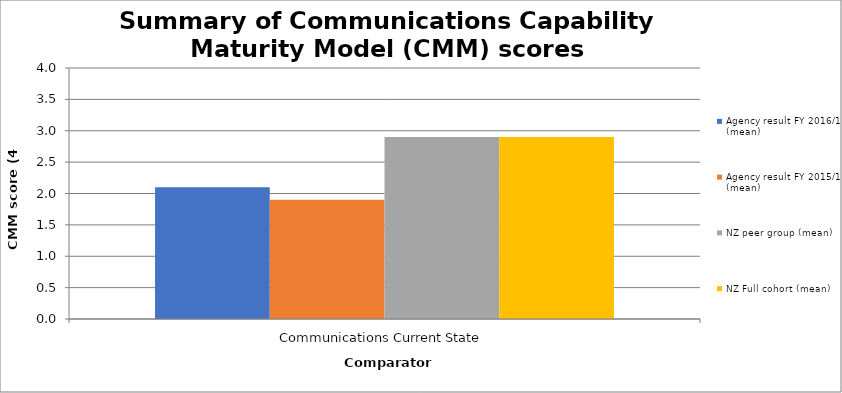
| Category | Agency result FY 2016/17 (mean) | Agency result FY 2015/16 (mean) | NZ peer group (mean) | NZ Full cohort (mean) |
|---|---|---|---|---|
| Communications Current State | 2.1 | 1.9 | 2.9 | 2.9 |